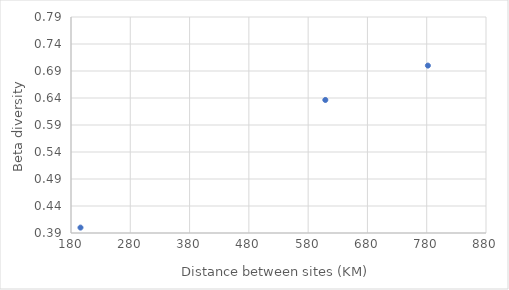
| Category | Beta diversity |
|---|---|
| 782.0 | 0.7 |
| 196.0 | 0.4 |
| 609.0 | 0.636 |